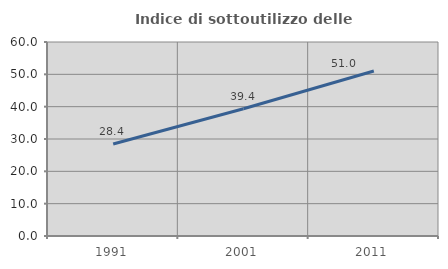
| Category | Indice di sottoutilizzo delle abitazioni  |
|---|---|
| 1991.0 | 28.443 |
| 2001.0 | 39.353 |
| 2011.0 | 51.032 |